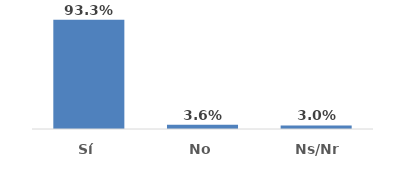
| Category | Series 0 |
|---|---|
| Sí | 0.933 |
| No | 0.036 |
| Ns/Nr | 0.03 |